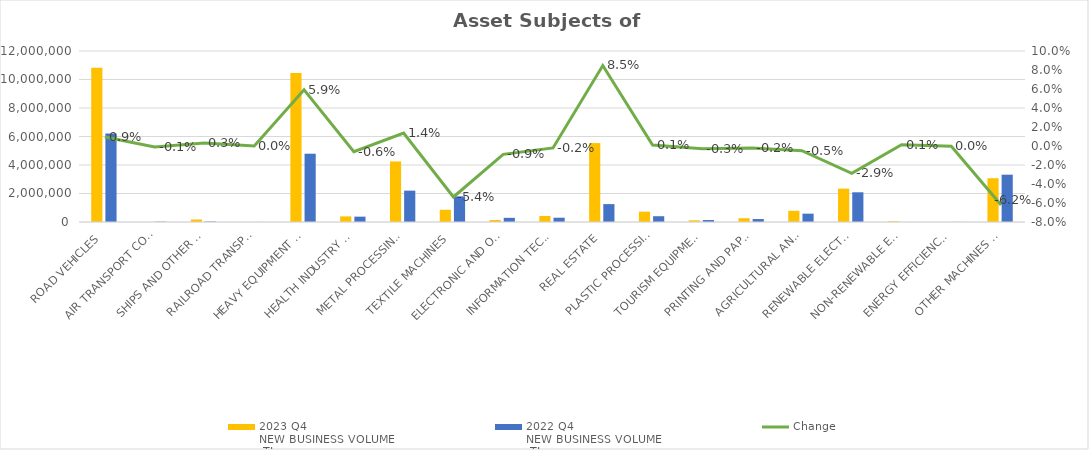
| Category | 2023 Q4 
NEW BUSINESS VOLUME
 TL | 2022 Q4 
NEW BUSINESS VOLUME
 TL |
|---|---|---|
| ROAD VEHICLES | 10820476.45 | 6205507.536 |
| AIR TRANSPORT CONVEYANCE | 0 | 22149 |
| SHIPS AND OTHER SEA-GOING VESSELS | 176867.155 | 32156 |
| RAILROAD TRANSPORT VEHICLES | 4630.25 | 2337 |
| HEAVY EQUIPMENT AND CONSTRUCTION MACHINERY | 10451455.047 | 4792789.163 |
| HEALTH INDUSTRY AND AESTHETIC INSTRUMENTS | 393770.18 | 375571.826 |
| METAL PROCESSING MACHINE | 4248400.276 | 2199682.716 |
| TEXTILE MACHINES | 858855.746 | 1799477.464 |
| ELECTRONIC AND OPTICAL DEVICES | 137680.744 | 293173.535 |
| INFORMATION TECHNOLOGIES AND OFFICE SYSTEMS | 423792.672 | 300661.237 |
| REAL ESTATE | 5536910.937 | 1255803.29 |
| PLASTIC PROCESSING MACHINES | 725695.531 | 405529.236 |
| TOURISM EQUIPMENT | 116417.439 | 136315.941 |
| PRINTING AND PAPER PROCESSING MACHINES | 264857.711 | 207078.963 |
| AGRICULTURAL AND LIVESTOCK FARMING MACHINES | 784513.201 | 584922.906 |
| RENEWABLE ELECTRICITY GENERATION | 2341629.444 | 2084702.188 |
| NON-RENEWABLE ELECTRIC ENERGY GENERATION | 51740 | 0 |
| ENERGY EFFICIENCY EQUIPMENT | 0 | 5470 |
| OTHER MACHINES AND EQUIPMENT | 3072852.335 | 3320587.501 |